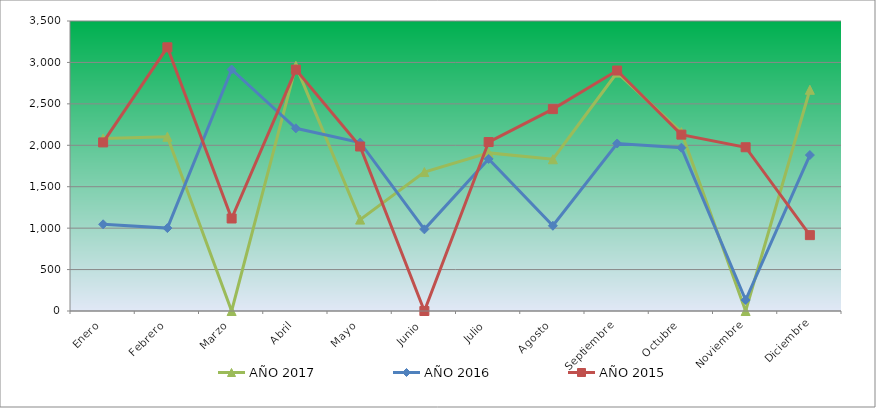
| Category | AÑO 2017 | AÑO 2016 | AÑO 2015 |
|---|---|---|---|
| Enero | 2082.828 | 1046.446 | 2034.741 |
| Febrero | 2102.721 | 1000.727 | 3182.468 |
| Marzo | 0 | 2914.544 | 1116.499 |
| Abril | 2959.264 | 2204.648 | 2913.239 |
| Mayo | 1102.882 | 2033.984 | 1985.177 |
| Junio | 1676.772 | 985.488 | 0 |
| Julio | 1908.242 | 1835.316 | 2039.112 |
| Agosto | 1831.297 | 1028.667 | 2436.475 |
| Septiembre | 2877.251 | 2021.774 | 2902.331 |
| Octubre | 2159.263 | 1970.976 | 2128.652 |
| Noviembre | 0 | 132.445 | 1976.438 |
| Diciembre | 2669.798 | 1882.079 | 915.634 |